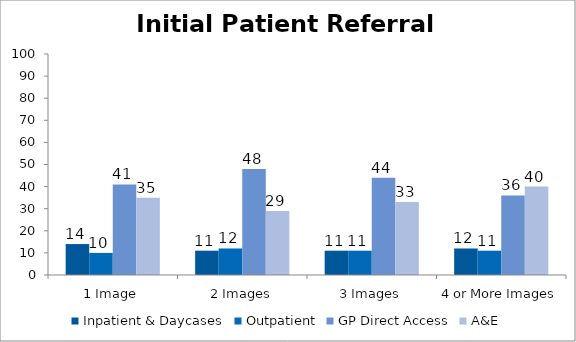
| Category | Inpatient & Daycases | Outpatient | GP Direct Access | A&E |
|---|---|---|---|---|
| 1 Image | 14 | 10 | 41 | 35 |
| 2 Images | 11 | 12 | 48 | 29 |
| 3 Images | 11 | 11 | 44 | 33 |
| 4 or More Images | 12 | 11 | 36 | 40 |